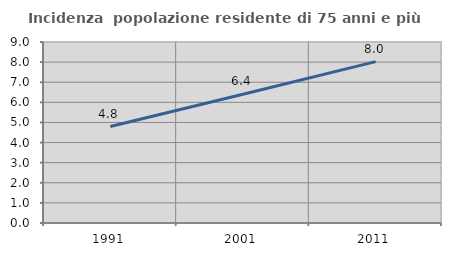
| Category | Incidenza  popolazione residente di 75 anni e più |
|---|---|
| 1991.0 | 4.795 |
| 2001.0 | 6.404 |
| 2011.0 | 8.025 |